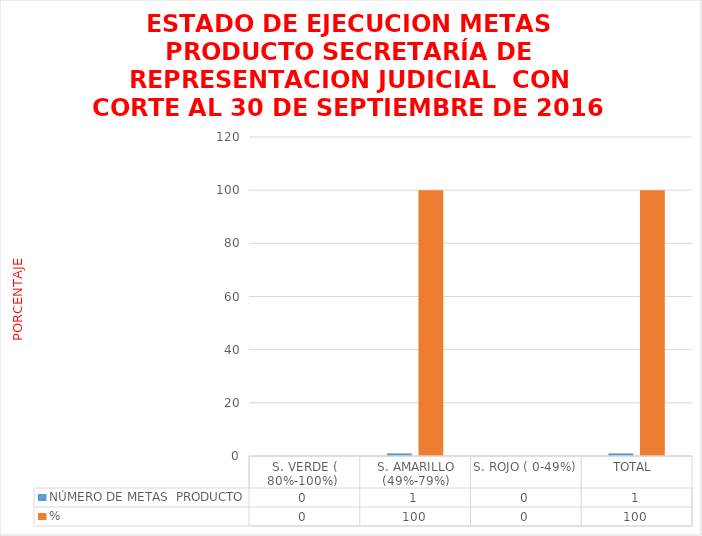
| Category | NÚMERO DE METAS  PRODUCTO  | % |
|---|---|---|
| S. VERDE ( 80%-100%)  | 0 | 0 |
| S. AMARILLO (49%-79%) | 1 | 100 |
| S. ROJO ( 0-49%) | 0 | 0 |
| TOTAL  | 1 | 100 |